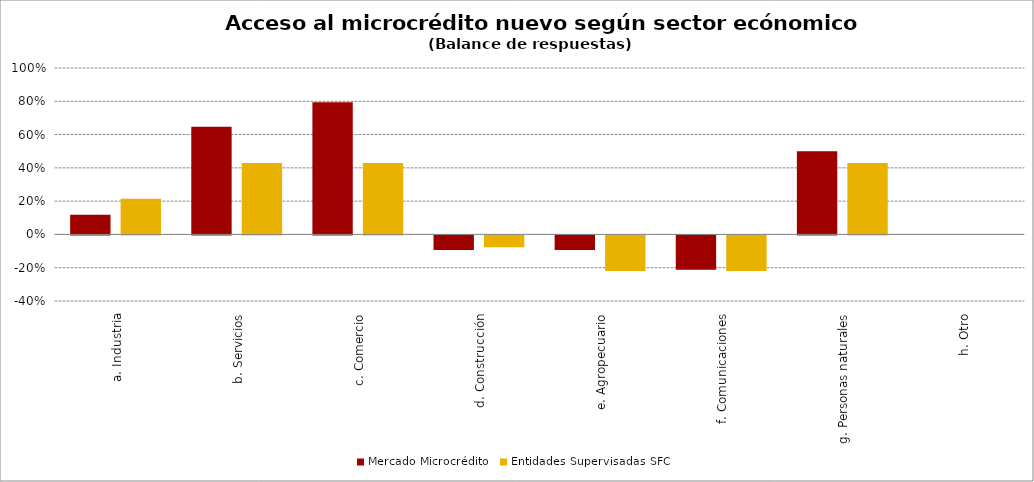
| Category | Mercado Microcrédito | Entidades Supervisadas SFC |
|---|---|---|
| a. Industria | 0.118 | 0.214 |
| b. Servicios | 0.647 | 0.429 |
| c. Comercio | 0.794 | 0.429 |
| d. Construcción | -0.088 | -0.071 |
| e. Agropecuario | -0.088 | -0.214 |
| f. Comunicaciones | -0.206 | -0.214 |
| g. Personas naturales | 0.5 | 0.429 |
| h. Otro | 0 | 0 |